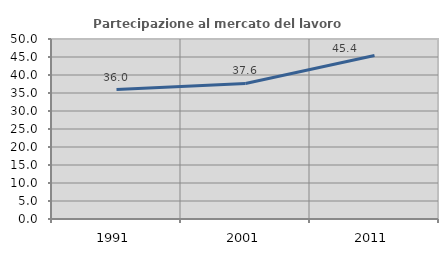
| Category | Partecipazione al mercato del lavoro  femminile |
|---|---|
| 1991.0 | 35.961 |
| 2001.0 | 37.645 |
| 2011.0 | 45.397 |